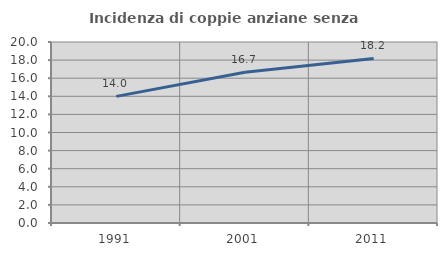
| Category | Incidenza di coppie anziane senza figli  |
|---|---|
| 1991.0 | 13.992 |
| 2001.0 | 16.667 |
| 2011.0 | 18.182 |